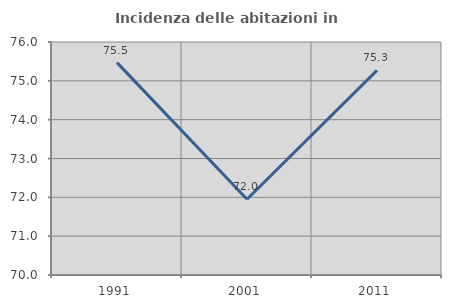
| Category | Incidenza delle abitazioni in proprietà  |
|---|---|
| 1991.0 | 75.47 |
| 2001.0 | 71.951 |
| 2011.0 | 75.271 |